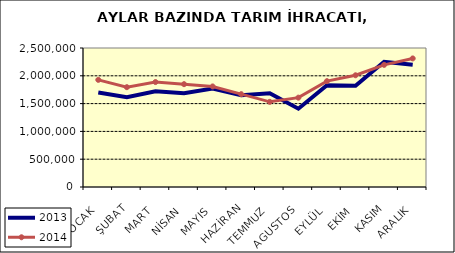
| Category | 2013 | 2014 |
|---|---|---|
| OCAK | 1699667.937 | 1927049.302 |
| ŞUBAT | 1613307.255 | 1795433.693 |
| MART | 1721276.592 | 1887619.528 |
| NİSAN | 1687304.657 | 1849497.008 |
| MAYIS | 1769600.592 | 1808607.778 |
| HAZİRAN | 1649716.747 | 1669541.498 |
| TEMMUZ | 1686787.97 | 1531557.844 |
| AGUSTOS | 1408589.772 | 1607114.449 |
| EYLÜL | 1831276.529 | 1903765.853 |
| EKİM | 1821904.657 | 2009359.358 |
| KASIM | 2251387.473 | 2196637.458 |
| ARALIK | 2200343.346 | 2312275.646 |